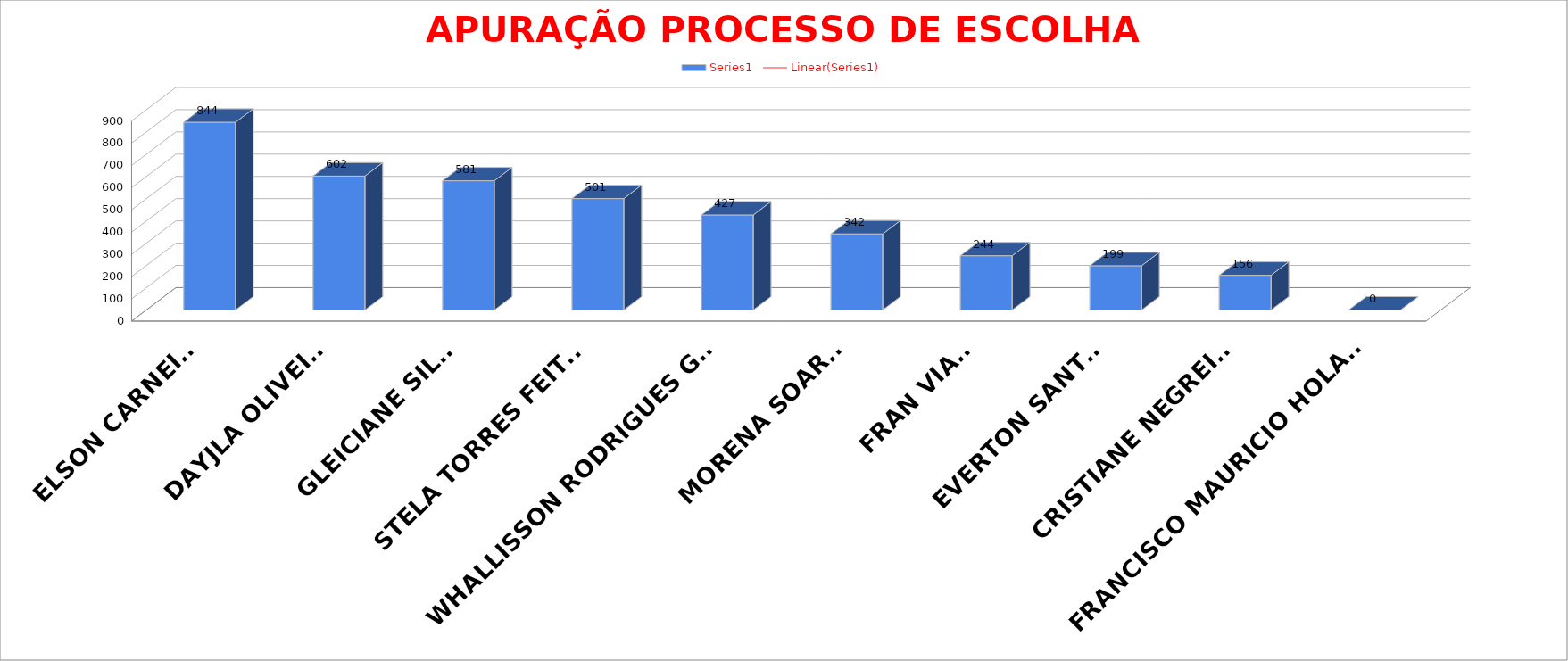
| Category | Series 0 |
|---|---|
| ELSON CARNEIRO | 844 |
| DAYJLA OLIVEIRA | 602 |
| GLEICIANE SILVA | 581 |
| STELA TORRES FEITOSA | 501 |
| WHALLISSON RODRIGUES GOMES | 427 |
| MORENA SOARES | 342 |
| FRAN VIANA | 244 |
| EVERTON SANTOS | 199 |
| CRISTIANE NEGREIROS | 156 |
| FRANCISCO MAURICIO HOLANDA | 0 |